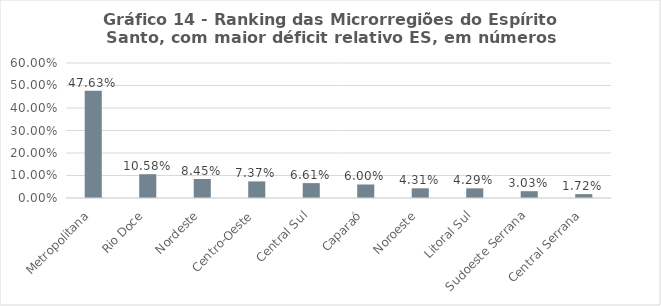
| Category | Series 0 |
|---|---|
| Metropolitana | 0.476 |
| Rio Doce | 0.106 |
| Nordeste | 0.084 |
| Centro-Oeste | 0.074 |
| Central Sul | 0.066 |
| Caparaó | 0.06 |
| Noroeste | 0.043 |
| Litoral Sul | 0.043 |
| Sudoeste Serrana | 0.03 |
| Central Serrana | 0.017 |